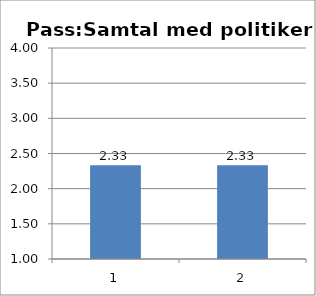
| Category | Series 0 |
|---|---|
| 0 | 2.333 |
| 1 | 2.333 |